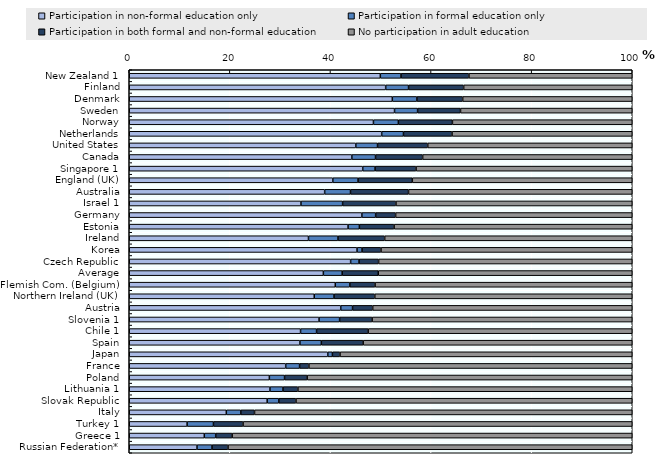
| Category | Participation in non-formal education only | Participation in formal education only | Participation in both formal and non-formal education | No participation in adult education |
|---|---|---|---|---|
| New Zealand 1 | 49.918 | 4.111 | 13.502 | 32.469 |
| Finland | 50.979 | 4.55 | 10.954 | 33.517 |
| Denmark | 52.301 | 4.885 | 9.102 | 33.712 |
| Sweden | 52.742 | 4.583 | 8.532 | 34.143 |
| Norway | 48.548 | 4.956 | 10.743 | 35.753 |
| Netherlands | 50.188 | 4.328 | 9.661 | 35.823 |
| United States | 45.041 | 4.318 | 9.984 | 40.657 |
| Canada | 44.252 | 4.709 | 9.368 | 41.671 |
| Singapore 1 | 46.416 | 2.453 | 8.156 | 42.975 |
| England (UK) | 40.47 | 5.017 | 10.79 | 43.724 |
| Australia | 38.849 | 5.134 | 11.538 | 44.478 |
| Israel 1 | 34.139 | 8.276 | 10.609 | 46.976 |
| Germany | 46.247 | 2.739 | 3.97 | 47.043 |
| Estonia | 43.505 | 2.246 | 6.902 | 47.347 |
| Ireland | 35.632 | 5.868 | 9.285 | 49.215 |
| Korea | 45.286 | 0.994 | 3.77 | 49.95 |
| Czech Republic | 44.012 | 1.673 | 3.889 | 50.426 |
| Average | 38.593 | 3.741 | 7.171 | 50.496 |
| Flemish Com. (Belgium) | 40.964 | 2.892 | 5.019 | 51.125 |
| Northern Ireland (UK) | 36.777 | 3.931 | 8.11 | 51.182 |
| Austria | 42.045 | 2.348 | 4.006 | 51.601 |
| Slovenia 1 | 37.733 | 4.089 | 6.469 | 51.709 |
| Chile 1 | 34.058 | 3.183 | 10.255 | 52.504 |
| Spain | 33.929 | 4.263 | 8.316 | 53.493 |
| Japan | 39.47 | 0.92 | 1.515 | 58.095 |
| France | 31.104 | 2.761 | 1.854 | 64.281 |
| Poland | 27.855 | 3.02 | 4.498 | 64.627 |
| Lithuania 1 | 27.974 | 2.591 | 2.968 | 66.467 |
| Slovak Republic | 27.422 | 2.305 | 3.423 | 66.85 |
| Italy | 19.299 | 2.879 | 2.728 | 75.094 |
| Turkey 1 | 11.506 | 5.234 | 5.888 | 77.373 |
| Greece 1 | 14.921 | 2.267 | 3.271 | 79.541 |
| Russian Federation* | 13.469 | 2.985 | 3.187 | 80.359 |